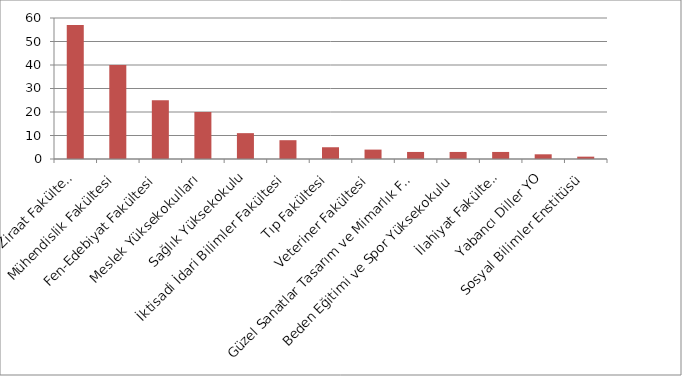
| Category | Series 0 |
|---|---|
| Ziraat Fakültesi | 57 |
| Mühendislik Fakültesi | 40 |
| Fen-Edebiyat Fakültesi | 25 |
| Meslek Yüksekokulları | 20 |
| Sağlık Yüksekokulu | 11 |
| İktisadi İdari Bilimler Fakültesi | 8 |
| Tıp Fakültesi | 5 |
| Veteriner Fakültesi | 4 |
| Güzel Sanatlar Tasarım ve Mimarlık Fakültesi | 3 |
| Beden Eğitimi ve Spor Yüksekokulu | 3 |
| İlahiyat Fakültesi | 3 |
| Yabancı Diller YO | 2 |
| Sosyal Bilimler Enstitüsü | 1 |